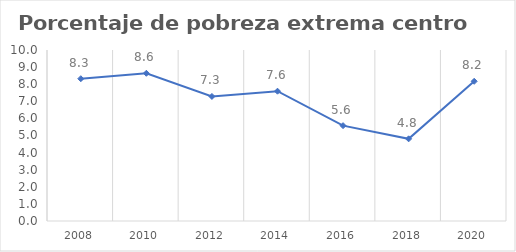
| Category | Series 0 |
|---|---|
| 2008.0 | 8.321 |
| 2010.0 | 8.639 |
| 2012.0 | 7.284 |
| 2014.0 | 7.59 |
| 2016.0 | 5.575 |
| 2018.0 | 4.805 |
| 2020.0 | 8.17 |